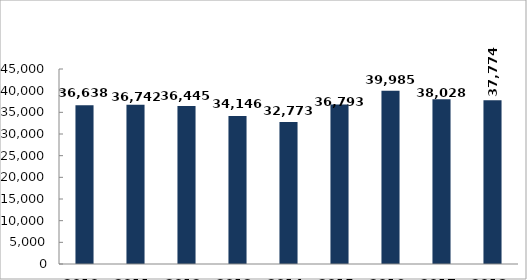
| Category | Közterületi szolgálati létszám (fő) |
|---|---|
| 2010. év | 36638 |
| 2011. év | 36742 |
| 2012. év | 36445 |
| 2013. év | 34146 |
| 2014. év | 32773 |
| 2015. év | 36793 |
| 2016. év | 39985 |
| 2017. év | 38028 |
| 2018. év | 37774 |